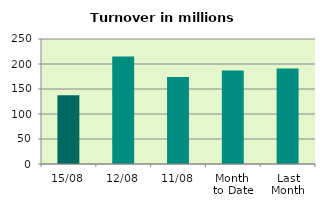
| Category | Series 0 |
|---|---|
| 15/08 | 137.445 |
| 12/08 | 214.963 |
| 11/08 | 174.227 |
| Month 
to Date | 186.854 |
| Last
Month | 191.038 |